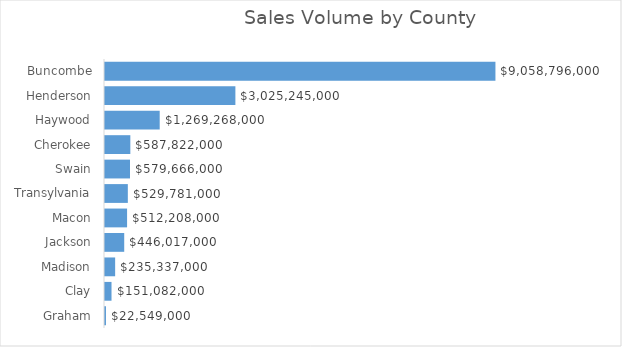
| Category | Total |
|---|---|
| Buncombe | 9058796000 |
| Henderson | 3025245000 |
| Haywood | 1269268000 |
| Cherokee | 587822000 |
| Swain | 579666000 |
| Transylvania | 529781000 |
| Macon | 512208000 |
| Jackson | 446017000 |
| Madison | 235337000 |
| Clay | 151082000 |
| Graham | 22549000 |